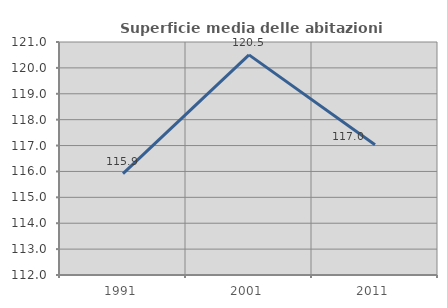
| Category | Superficie media delle abitazioni occupate |
|---|---|
| 1991.0 | 115.918 |
| 2001.0 | 120.504 |
| 2011.0 | 117.028 |